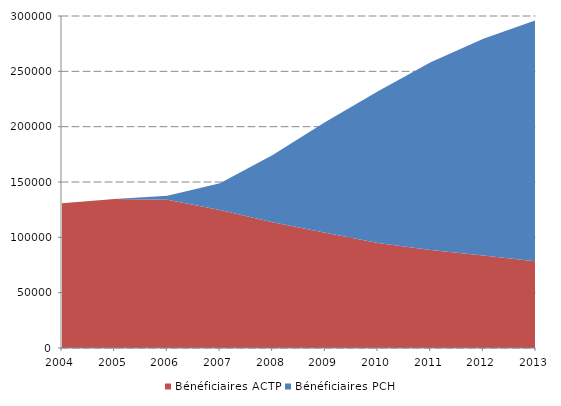
| Category | Bénéficiaires ACTP | Bénéficiaires PCH |
|---|---|---|
| 2004.0 | 130794.435 | 0 |
| 2005.0 | 134691.414 | 0 |
| 2006.0 | 133903.538 | 3590 |
| 2007.0 | 124806.622 | 23979.279 |
| 2008.0 | 113713.313 | 60753.963 |
| 2009.0 | 104042.899 | 100229.502 |
| 2010.0 | 94903.346 | 137033.391 |
| 2011.0 | 88573.939 | 169626.917 |
| 2012.0 | 83570.19 | 195940.205 |
| 2013.0 | 78224.543 | 217990.247 |